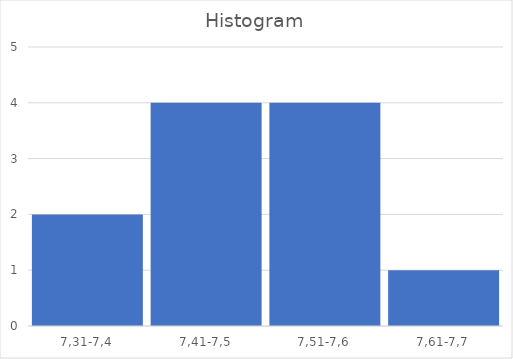
| Category | Series 0 |
|---|---|
| 7,31-7,4 | 2 |
| 7,41-7,5 | 4 |
| 7,51-7,6 | 4 |
| 7,61-7,7 | 1 |